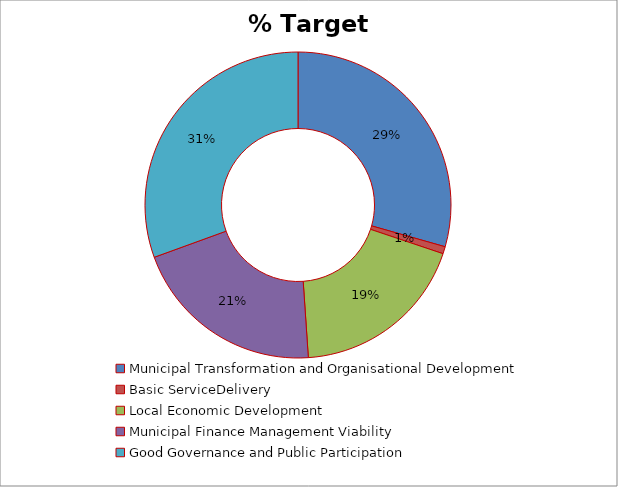
| Category | % Target achieved |
|---|---|
| Municipal Transformation and Organisational Development | 0.448 |
| Basic ServiceDelivery | 0.012 |
| Local Economic Development | 0.286 |
| Municipal Finance Management Viability | 0.312 |
| Good Governance and Public Participation | 0.465 |